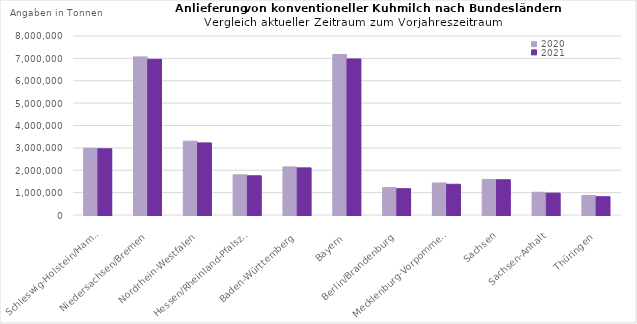
| Category | 2020 | 2021 |
|---|---|---|
| Schleswig-Holstein/Hamburg | 2982246.713 | 2959957.448 |
| Niedersachsen/Bremen | 7066800.654 | 6957380.935 |
| Nordrhein-Westfalen | 3300468.463 | 3223427.247 |
| Hessen/Rheinland-PfalszSaarland | 1795998.321 | 1753018.973 |
| Baden-Württemberg | 2148526.393 | 2106546.482 |
| Bayern | 7171899.893 | 6973856.936 |
| Berlin/Brandenburg | 1221095.3 | 1175732.777 |
| Mecklenburg-Vorpommern | 1431047.006 | 1373316.521 |
| Sachsen | 1591312.599 | 1576550.327 |
| Sachsen-Anhalt | 1015992.188 | 978594.879 |
| Thüringen | 866795.337 | 818998.735 |